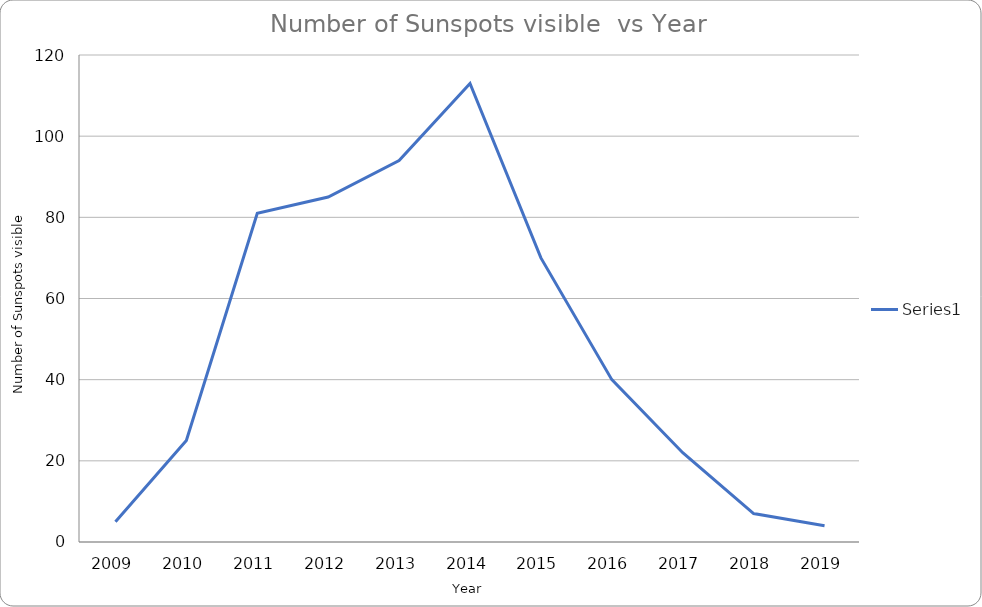
| Category | Series 0 |
|---|---|
| 2009.0 | 5 |
| 2010.0 | 25 |
| 2011.0 | 81 |
| 2012.0 | 85 |
| 2013.0 | 94 |
| 2014.0 | 113 |
| 2015.0 | 70 |
| 2016.0 | 40 |
| 2017.0 | 22 |
| 2018.0 | 7 |
| 2019.0 | 4 |